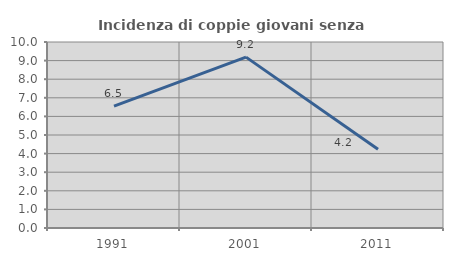
| Category | Incidenza di coppie giovani senza figli |
|---|---|
| 1991.0 | 6.549 |
| 2001.0 | 9.188 |
| 2011.0 | 4.232 |